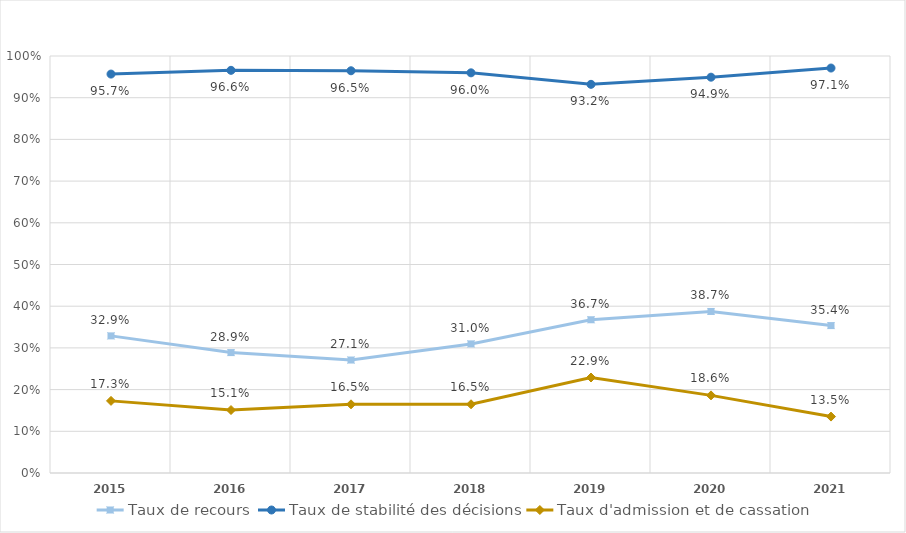
| Category | Taux de recours | Taux de stabilité des décisions | Taux d'admission et de cassation |
|---|---|---|---|
| 2015.0 | 0.329 | 0.957 | 0.173 |
| 2016.0 | 0.289 | 0.966 | 0.151 |
| 2017.0 | 0.271 | 0.965 | 0.165 |
| 2018.0 | 0.31 | 0.96 | 0.165 |
| 2019.0 | 0.367 | 0.932 | 0.229 |
| 2020.0 | 0.387 | 0.949 | 0.186 |
| 2021.0 | 0.354 | 0.971 | 0.135 |